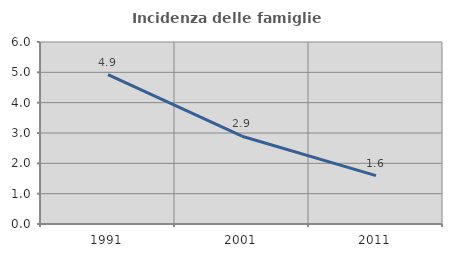
| Category | Incidenza delle famiglie numerose |
|---|---|
| 1991.0 | 4.925 |
| 2001.0 | 2.894 |
| 2011.0 | 1.597 |